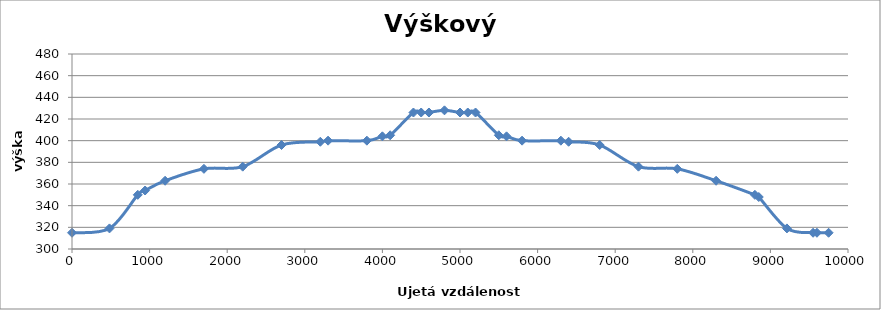
| Category | Series 0 |
|---|---|
| 0.0 | 315 |
| 483.0 | 319 |
| 848.0 | 350 |
| 942.0 | 354 |
| 1200.0 | 363 |
| 1700.0 | 374 |
| 2200.0 | 376 |
| 2700.0 | 396 |
| 3200.0 | 399 |
| 3300.0 | 400 |
| 3800.0 | 400 |
| 4000.0 | 404 |
| 4100.0 | 405 |
| 4400.0 | 426 |
| 4500.0 | 426 |
| 4600.0 | 426 |
| 4600.0 | 426 |
| 4800.0 | 428 |
| 5000.0 | 426 |
| 5100.0 | 426 |
| 5200.0 | 426 |
| 5500.0 | 405 |
| 5600.0 | 404 |
| 5800.0 | 400 |
| 6300.0 | 400 |
| 6400.0 | 399 |
| 6800.0 | 396 |
| 7300.0 | 376 |
| 7800.0 | 374 |
| 8300.0 | 363 |
| 8800.0 | 350 |
| 8850.0 | 348 |
| 9213.0 | 319 |
| 9550.0 | 315 |
| 9600.0 | 315 |
| 9750.0 | 315 |